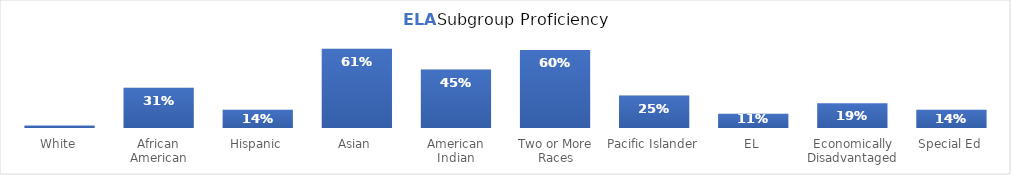
| Category | ELA |
|---|---|
| White | 0.02 |
| African American | 0.31 |
| Hispanic | 0.14 |
| Asian | 0.61 |
| American Indian | 0.45 |
| Two or More Races | 0.6 |
| Pacific Islander | 0.25 |
| EL | 0.11 |
| Economically Disadvantaged | 0.19 |
| Special Ed | 0.14 |